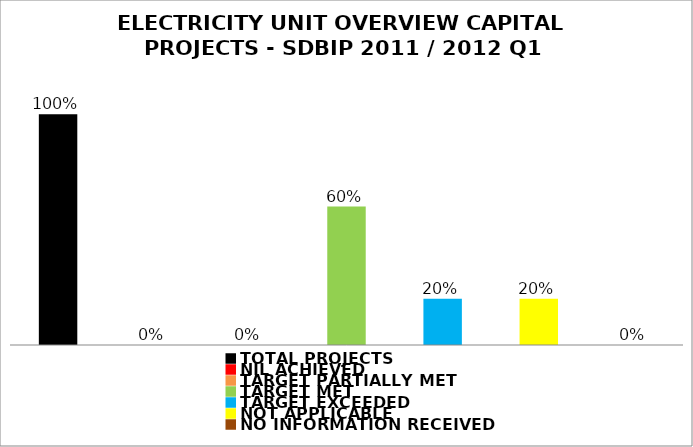
| Category | Series 1 |
|---|---|
| TOTAL PROJECTS | 1 |
| NIL ACHIEVED | 0 |
| TARGET PARTIALLY MET | 0 |
| TARGET MET | 0.6 |
| TARGET EXCEEDED | 0.2 |
| NOT APPLICABLE | 0.2 |
| NO INFORMATION RECEIVED | 0 |